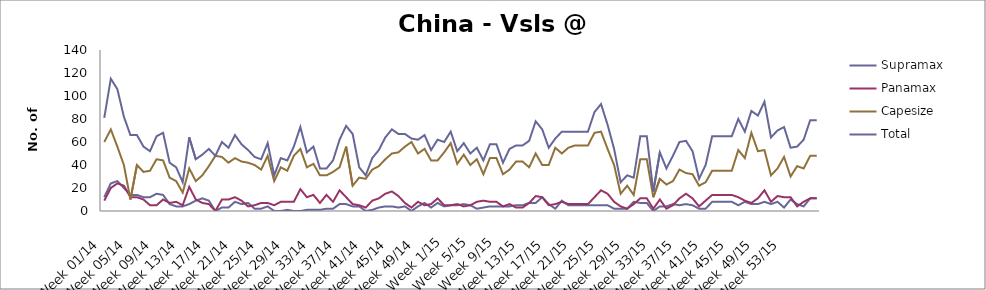
| Category | Supramax | Panamax | Capesize | Total |
|---|---|---|---|---|
| Week 01/14 | 12 | 9 | 60 | 81 |
| Week 02/14 | 24 | 20 | 71 | 115 |
| Week 03/14 | 26 | 24 | 56 | 106 |
| Week 04/14 | 20 | 22 | 40 | 82 |
| Week 05/14 | 14 | 12 | 10 | 66 |
| Week 06/14 | 14 | 12 | 40 | 66 |
| Week 07/14 | 12 | 10 | 34 | 56 |
| Week 08/14 | 12 | 5 | 35 | 52 |
| Week 09/14 | 15 | 5 | 45 | 65 |
| Week 10/14 | 14 | 10 | 44 | 68 |
| Week 11/14 | 6 | 7 | 29 | 42 |
| Week 12/14 | 4 | 8 | 26 | 38 |
| Week 13/14 | 4 | 5 | 16 | 25 |
| Week 14/14 | 6 | 21 | 37 | 64 |
| Week 15/14 | 9 | 10 | 26 | 45 |
| Week 16/14 | 11 | 7 | 31 | 49 |
| Week 17/14 | 9 | 6 | 39 | 54 |
| Week 18/14 | 0 | 0 | 48 | 48 |
| Week 19/14 | 3 | 10 | 47 | 60 |
| Week 20/14 | 3 | 10 | 42 | 55 |
| Week 21/14 | 8 | 12 | 46 | 66 |
| Week 22/14 | 6 | 9 | 43 | 58 |
| Week 23/14 | 7 | 4 | 42 | 53 |
| Week 24/14 | 2 | 5 | 40 | 47 |
| Week 25/14 | 2 | 7 | 36 | 45 |
| Week 26/14 | 4 | 7 | 48 | 59 |
| Week 27/14 | 0 | 5 | 26 | 31 |
| Week 28/14 | 0 | 8 | 38 | 46 |
| Week 29/14 | 1 | 8 | 35 | 44 |
| Week 30/14 | 0 | 8 | 48 | 56 |
| Week 31/14 | 0 | 19 | 54 | 73 |
| Week 32/14 | 1 | 12 | 38 | 51 |
| Week 33/14 | 1 | 14 | 41 | 56 |
| Week 34/14 | 1 | 7 | 31 | 37 |
| Week 35/14 | 2 | 14 | 31 | 37 |
| Week 36/14 | 2 | 8 | 34 | 44 |
| Week 37/14 | 6 | 18 | 38 | 62 |
| Week 38/14 | 6 | 12 | 56 | 74 |
| Week 39/14 | 4 | 6 | 22 | 67 |
| Week 40/14 | 4 | 5 | 29 | 38 |
| Week 41/14 | 0 | 3 | 28 | 31 |
| Week 42/14 | 1 | 9 | 36 | 46 |
| Week 43/14 | 3 | 11 | 39 | 53 |
| Week 44/14 | 4 | 15 | 45 | 64 |
| Week 45/14 | 4 | 17 | 50 | 71 |
| Week 46/14 | 3 | 13 | 51 | 67 |
| Week 47/14 | 4 | 7 | 56 | 67 |
| Week 48/14 | 0 | 3 | 60 | 63 |
| Week 49/14 | 4 | 8 | 50 | 62 |
| Week 50/14 | 7 | 5 | 54 | 66 |
| Week 51/14 | 3 | 6 | 44 | 53 |
| Week 52/14 | 7 | 11 | 44 | 62 |
| Week 1/15 | 4 | 5 | 51 | 60 |
| Week 2/15 | 5 | 5 | 59 | 69 |
| Week 3/15 | 5 | 6 | 41 | 52 |
| Week 4/15 | 6 | 4 | 49 | 59 |
| Week 5/15 | 5 | 5 | 40 | 50 |
| Week 6/15 | 2 | 8 | 45 | 55 |
| Week 7/15 | 3 | 9 | 32 | 44 |
| Week 8/15 | 4 | 8 | 46 | 58 |
| Week 9/15 | 4 | 8 | 46 | 58 |
| Week 10/15 | 4 | 4 | 32 | 42 |
| Week 11/15 | 4 | 6 | 36 | 54 |
| Week 12/15 | 5 | 3 | 43 | 57 |
| Week 13/15 | 5 | 3 | 43 | 57 |
| Week 14/15 | 7 | 7 | 38 | 61 |
| Week 15/15 | 7 | 13 | 50 | 78 |
| Week 16/15 | 12 | 12 | 40 | 71 |
| Week 17/15 | 6 | 5 | 40 | 55 |
| Week 18/15 | 2 | 6 | 55 | 63 |
| Week 19/15 | 9 | 8 | 50 | 69 |
| Week 20/15 | 5 | 6 | 55 | 69 |
| Week 21/15 | 5 | 6 | 57 | 69 |
| Week 22/15 | 5 | 6 | 57 | 69 |
| Week 23/15 | 5 | 6 | 57 | 69 |
| Week 24/15 | 5 | 12 | 68 | 86 |
| Week 25/15 | 5 | 18 | 69 | 93 |
| Week 26/15 | 5 | 15 | 54 | 75 |
| Week 27/15 | 2 | 8 | 40 | 54 |
| Week 28/15 | 2 | 4 | 15 | 25 |
| Week 29/15 | 2 | 2 | 22 | 31 |
| Week 30/15 | 8 | 6 | 14 | 29 |
| Week 31/15 | 7 | 11 | 45 | 65 |
| Week 32/15 | 7 | 11 | 45 | 65 |
| Week 33/15 | 0 | 2 | 12 | 17 |
| Week 34/15 | 4 | 10 | 28 | 51 |
| Week 35/15 | 4 | 2 | 23 | 37 |
| Week 36/15 | 6 | 5 | 26 | 48 |
| Week 37/15 | 5 | 11 | 36 | 60 |
| Week 38/15 | 6 | 15 | 33 | 61 |
| Week 39/15 | 5 | 11 | 32 | 52 |
| Week 40/15 | 2 | 4 | 22 | 28 |
| Week 41/15 | 2 | 9 | 25 | 40 |
| Week 42/15 | 8 | 14 | 35 | 65 |
| Week 43/15 | 8 | 14 | 35 | 65 |
| Week 44/15 | 8 | 14 | 35 | 65 |
| Week 45/15 | 8 | 14 | 35 | 65 |
| Week 46/15 | 5 | 12 | 53 | 80 |
| Week 47/15 | 8 | 9 | 46 | 69 |
| Week 48/15 | 6 | 7 | 68 | 87 |
| Week 49/15 | 6 | 11 | 52 | 83 |
| Week 50/15 | 8 | 18 | 53 | 95 |
| Week 51/15 | 6 | 8 | 31 | 64 |
| Week 52/15 | 8 | 13 | 37 | 70 |
| Week 53/15 | 3 | 12 | 47 | 73 |
| Week 01/16 | 10 | 12 | 30 | 55 |